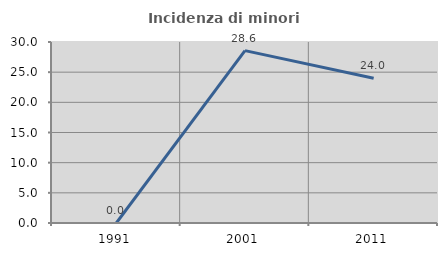
| Category | Incidenza di minori stranieri |
|---|---|
| 1991.0 | 0 |
| 2001.0 | 28.571 |
| 2011.0 | 24 |